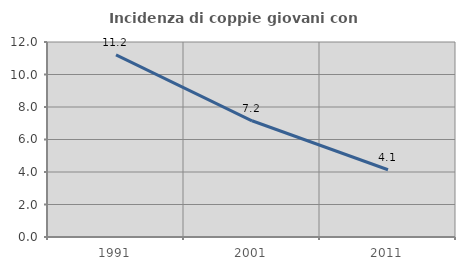
| Category | Incidenza di coppie giovani con figli |
|---|---|
| 1991.0 | 11.208 |
| 2001.0 | 7.152 |
| 2011.0 | 4.137 |